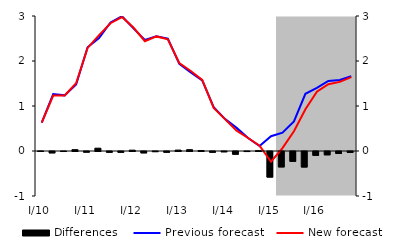
| Category | Differences |
|---|---|
| 0 | 0.001 |
| 1 | -0.03 |
| 2 | 0 |
| 3 | 0.03 |
| 4 | -0.014 |
| 5 | 0.063 |
| 6 | -0.017 |
| 7 | -0.017 |
| 8 | 0.019 |
| 9 | -0.03 |
| 10 | -0.003 |
| 11 | -0.017 |
| 12 | 0.02 |
| 13 | 0.03 |
| 14 | 0.011 |
| 15 | -0.017 |
| 16 | -0.006 |
| 17 | -0.061 |
| 18 | -0.001 |
| 19 | 0.007 |
| 20 | -0.568 |
| 21 | -0.342 |
| 22 | -0.218 |
| 23 | -0.344 |
| 24 | -0.084 |
| 25 | -0.073 |
| 26 | -0.044 |
| 27 | -0.02 |